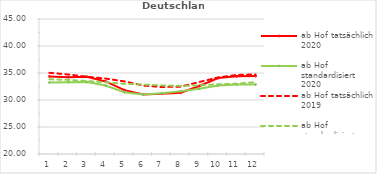
| Category | ab Hof tatsächlich 2020 | ab Hof standardisiert 2020 | ab Hof tatsächlich 2019 | ab Hof standardisiert 2019 |
|---|---|---|---|---|
| 0 | 34.37 | 33.236 | 35.032 | 33.833 |
| 1 | 34.232 | 33.305 | 34.722 | 33.72 |
| 2 | 34.307 | 33.349 | 34.309 | 33.511 |
| 3 | 33.437 | 32.673 | 33.973 | 33.294 |
| 4 | 31.829 | 31.435 | 33.443 | 32.993 |
| 5 | 31.034 | 31.021 | 32.682 | 32.867 |
| 6 | 31.165 | 31.262 | 32.407 | 32.707 |
| 7 | 31.359 | 31.622 | 32.475 | 32.609 |
| 8 | 32.599 | 32.083 | 33.332 | 32.71 |
| 9 | 34.06 | 32.674 | 34.181 | 32.92 |
| 10 | 34.386 | 32.861 | 34.634 | 33.019 |
| 11 | 34.43 | 32.881 | 34.744 | 33.308 |